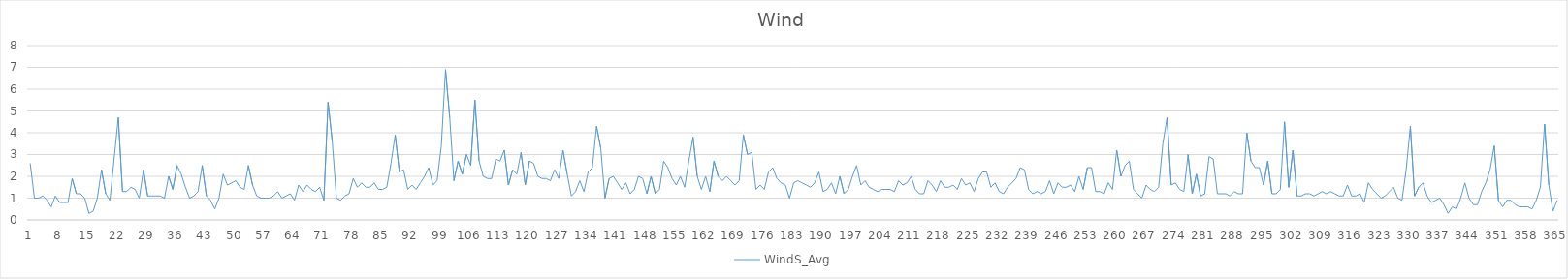
| Category | WindS_Avg |
|---|---|
| 0 | 2.6 |
| 1 | 1 |
| 2 | 1 |
| 3 | 1.1 |
| 4 | 0.9 |
| 5 | 0.6 |
| 6 | 1.1 |
| 7 | 0.8 |
| 8 | 0.8 |
| 9 | 0.8 |
| 10 | 1.9 |
| 11 | 1.2 |
| 12 | 1.2 |
| 13 | 1 |
| 14 | 0.3 |
| 15 | 0.4 |
| 16 | 1 |
| 17 | 2.3 |
| 18 | 1.2 |
| 19 | 0.9 |
| 20 | 2.8 |
| 21 | 4.7 |
| 22 | 1.3 |
| 23 | 1.3 |
| 24 | 1.5 |
| 25 | 1.4 |
| 26 | 1 |
| 27 | 2.3 |
| 28 | 1.1 |
| 29 | 1.1 |
| 30 | 1.1 |
| 31 | 1.1 |
| 32 | 1 |
| 33 | 2 |
| 34 | 1.4 |
| 35 | 2.5 |
| 36 | 2.1 |
| 37 | 1.5 |
| 38 | 1 |
| 39 | 1.1 |
| 40 | 1.3 |
| 41 | 2.5 |
| 42 | 1.1 |
| 43 | 0.9 |
| 44 | 0.5 |
| 45 | 1 |
| 46 | 2.1 |
| 47 | 1.6 |
| 48 | 1.7 |
| 49 | 1.8 |
| 50 | 1.5 |
| 51 | 1.4 |
| 52 | 2.5 |
| 53 | 1.6 |
| 54 | 1.1 |
| 55 | 1 |
| 56 | 1 |
| 57 | 1 |
| 58 | 1.1 |
| 59 | 1.3 |
| 60 | 1 |
| 61 | 1.1 |
| 62 | 1.2 |
| 63 | 0.9 |
| 64 | 1.6 |
| 65 | 1.3 |
| 66 | 1.6 |
| 67 | 1.4 |
| 68 | 1.3 |
| 69 | 1.5 |
| 70 | 0.9 |
| 71 | 5.4 |
| 72 | 3.6 |
| 73 | 1 |
| 74 | 0.9 |
| 75 | 1.1 |
| 76 | 1.2 |
| 77 | 1.9 |
| 78 | 1.5 |
| 79 | 1.7 |
| 80 | 1.5 |
| 81 | 1.5 |
| 82 | 1.7 |
| 83 | 1.4 |
| 84 | 1.4 |
| 85 | 1.5 |
| 86 | 2.6 |
| 87 | 3.9 |
| 88 | 2.2 |
| 89 | 2.3 |
| 90 | 1.4 |
| 91 | 1.6 |
| 92 | 1.4 |
| 93 | 1.7 |
| 94 | 2 |
| 95 | 2.4 |
| 96 | 1.6 |
| 97 | 1.8 |
| 98 | 3.4 |
| 99 | 6.9 |
| 100 | 4.7 |
| 101 | 1.8 |
| 102 | 2.7 |
| 103 | 2.1 |
| 104 | 3 |
| 105 | 2.5 |
| 106 | 5.5 |
| 107 | 2.7 |
| 108 | 2 |
| 109 | 1.9 |
| 110 | 1.9 |
| 111 | 2.8 |
| 112 | 2.7 |
| 113 | 3.2 |
| 114 | 1.6 |
| 115 | 2.3 |
| 116 | 2.1 |
| 117 | 3.1 |
| 118 | 1.6 |
| 119 | 2.7 |
| 120 | 2.6 |
| 121 | 2 |
| 122 | 1.9 |
| 123 | 1.9 |
| 124 | 1.8 |
| 125 | 2.3 |
| 126 | 1.9 |
| 127 | 3.2 |
| 128 | 2.1 |
| 129 | 1.1 |
| 130 | 1.3 |
| 131 | 1.8 |
| 132 | 1.3 |
| 133 | 2.2 |
| 134 | 2.4 |
| 135 | 4.3 |
| 136 | 3.3 |
| 137 | 1 |
| 138 | 1.9 |
| 139 | 2 |
| 140 | 1.7 |
| 141 | 1.4 |
| 142 | 1.7 |
| 143 | 1.2 |
| 144 | 1.4 |
| 145 | 2 |
| 146 | 1.9 |
| 147 | 1.2 |
| 148 | 2 |
| 149 | 1.2 |
| 150 | 1.4 |
| 151 | 2.7 |
| 152 | 2.4 |
| 153 | 1.9 |
| 154 | 1.6 |
| 155 | 2 |
| 156 | 1.5 |
| 157 | 2.7 |
| 158 | 3.8 |
| 159 | 2 |
| 160 | 1.4 |
| 161 | 2 |
| 162 | 1.3 |
| 163 | 2.7 |
| 164 | 2 |
| 165 | 1.8 |
| 166 | 2 |
| 167 | 1.8 |
| 168 | 1.6 |
| 169 | 1.8 |
| 170 | 3.9 |
| 171 | 3 |
| 172 | 3.1 |
| 173 | 1.4 |
| 174 | 1.6 |
| 175 | 1.4 |
| 176 | 2.2 |
| 177 | 2.4 |
| 178 | 1.9 |
| 179 | 1.7 |
| 180 | 1.6 |
| 181 | 1 |
| 182 | 1.7 |
| 183 | 1.8 |
| 184 | 1.7 |
| 185 | 1.6 |
| 186 | 1.5 |
| 187 | 1.7 |
| 188 | 2.2 |
| 189 | 1.3 |
| 190 | 1.4 |
| 191 | 1.7 |
| 192 | 1.2 |
| 193 | 2 |
| 194 | 1.2 |
| 195 | 1.4 |
| 196 | 2 |
| 197 | 2.5 |
| 198 | 1.6 |
| 199 | 1.8 |
| 200 | 1.5 |
| 201 | 1.4 |
| 202 | 1.3 |
| 203 | 1.4 |
| 204 | 1.4 |
| 205 | 1.4 |
| 206 | 1.3 |
| 207 | 1.8 |
| 208 | 1.6 |
| 209 | 1.7 |
| 210 | 2 |
| 211 | 1.4 |
| 212 | 1.2 |
| 213 | 1.2 |
| 214 | 1.8 |
| 215 | 1.6 |
| 216 | 1.3 |
| 217 | 1.8 |
| 218 | 1.5 |
| 219 | 1.5 |
| 220 | 1.6 |
| 221 | 1.4 |
| 222 | 1.9 |
| 223 | 1.6 |
| 224 | 1.7 |
| 225 | 1.3 |
| 226 | 1.9 |
| 227 | 2.2 |
| 228 | 2.2 |
| 229 | 1.5 |
| 230 | 1.7 |
| 231 | 1.3 |
| 232 | 1.2 |
| 233 | 1.5 |
| 234 | 1.7 |
| 235 | 1.9 |
| 236 | 2.4 |
| 237 | 2.3 |
| 238 | 1.4 |
| 239 | 1.2 |
| 240 | 1.3 |
| 241 | 1.2 |
| 242 | 1.3 |
| 243 | 1.8 |
| 244 | 1.2 |
| 245 | 1.7 |
| 246 | 1.5 |
| 247 | 1.5 |
| 248 | 1.6 |
| 249 | 1.3 |
| 250 | 2 |
| 251 | 1.4 |
| 252 | 2.4 |
| 253 | 2.4 |
| 254 | 1.3 |
| 255 | 1.3 |
| 256 | 1.2 |
| 257 | 1.7 |
| 258 | 1.4 |
| 259 | 3.2 |
| 260 | 2 |
| 261 | 2.5 |
| 262 | 2.7 |
| 263 | 1.4 |
| 264 | 1.2 |
| 265 | 1 |
| 266 | 1.6 |
| 267 | 1.4 |
| 268 | 1.3 |
| 269 | 1.5 |
| 270 | 3.5 |
| 271 | 4.7 |
| 272 | 1.6 |
| 273 | 1.7 |
| 274 | 1.4 |
| 275 | 1.3 |
| 276 | 3 |
| 277 | 1.2 |
| 278 | 2.1 |
| 279 | 1.1 |
| 280 | 1.2 |
| 281 | 2.9 |
| 282 | 2.8 |
| 283 | 1.2 |
| 284 | 1.2 |
| 285 | 1.2 |
| 286 | 1.1 |
| 287 | 1.3 |
| 288 | 1.2 |
| 289 | 1.2 |
| 290 | 4 |
| 291 | 2.7 |
| 292 | 2.4 |
| 293 | 2.4 |
| 294 | 1.6 |
| 295 | 2.7 |
| 296 | 1.2 |
| 297 | 1.2 |
| 298 | 1.4 |
| 299 | 4.5 |
| 300 | 1.5 |
| 301 | 3.2 |
| 302 | 1.1 |
| 303 | 1.1 |
| 304 | 1.2 |
| 305 | 1.2 |
| 306 | 1.1 |
| 307 | 1.2 |
| 308 | 1.3 |
| 309 | 1.2 |
| 310 | 1.3 |
| 311 | 1.2 |
| 312 | 1.1 |
| 313 | 1.1 |
| 314 | 1.6 |
| 315 | 1.1 |
| 316 | 1.1 |
| 317 | 1.2 |
| 318 | 0.8 |
| 319 | 1.7 |
| 320 | 1.4 |
| 321 | 1.2 |
| 322 | 1 |
| 323 | 1.1 |
| 324 | 1.3 |
| 325 | 1.5 |
| 326 | 1 |
| 327 | 0.9 |
| 328 | 2.3 |
| 329 | 4.3 |
| 330 | 1.1 |
| 331 | 1.5 |
| 332 | 1.7 |
| 333 | 1.1 |
| 334 | 0.8 |
| 335 | 0.9 |
| 336 | 1 |
| 337 | 0.7 |
| 338 | 0.3 |
| 339 | 0.6 |
| 340 | 0.5 |
| 341 | 1 |
| 342 | 1.7 |
| 343 | 1 |
| 344 | 0.7 |
| 345 | 0.7 |
| 346 | 1.3 |
| 347 | 1.7 |
| 348 | 2.3 |
| 349 | 3.4 |
| 350 | 0.9 |
| 351 | 0.6 |
| 352 | 0.9 |
| 353 | 0.9 |
| 354 | 0.7 |
| 355 | 0.6 |
| 356 | 0.6 |
| 357 | 0.6 |
| 358 | 0.5 |
| 359 | 0.9 |
| 360 | 1.5 |
| 361 | 4.4 |
| 362 | 1.6 |
| 363 | 0.4 |
| 364 | 0.9 |